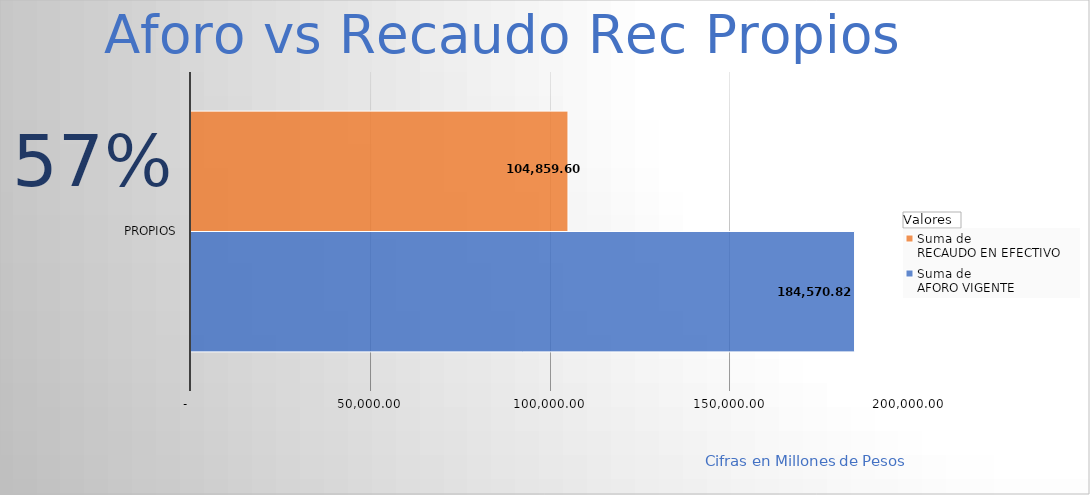
| Category | Suma de 
AFORO VIGENTE
 | Suma de 
RECAUDO EN EFECTIVO 
 |
|---|---|---|
| Propios | 184570.824 | 104859.602 |